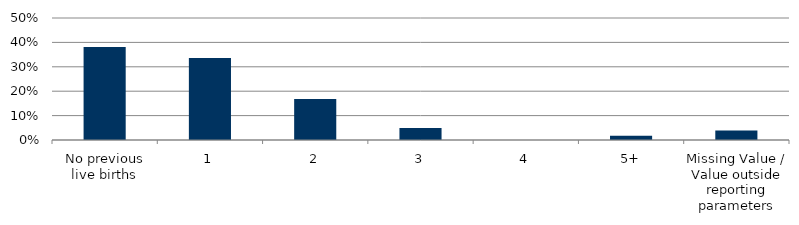
| Category | Total |
|---|---|
| No previous live births | 0.381 |
| 1 | 0.336 |
| 2 | 0.168 |
| 3 | 0.049 |
| 4 | 0 |
| 5+ | 0.017 |
| Missing Value / Value outside reporting parameters | 0.038 |